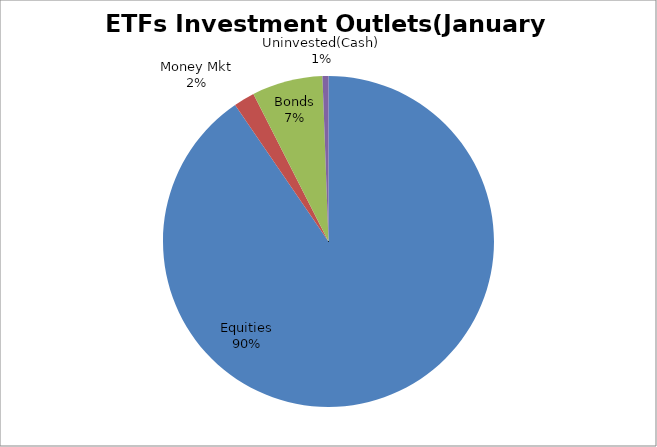
| Category | Series 0 |
|---|---|
| Equities | 6042563240.56 |
| Money Mkt | 136904370.35 |
| Bonds | 461893095.23 |
| Uninvested(Cash) | 38893765.13 |